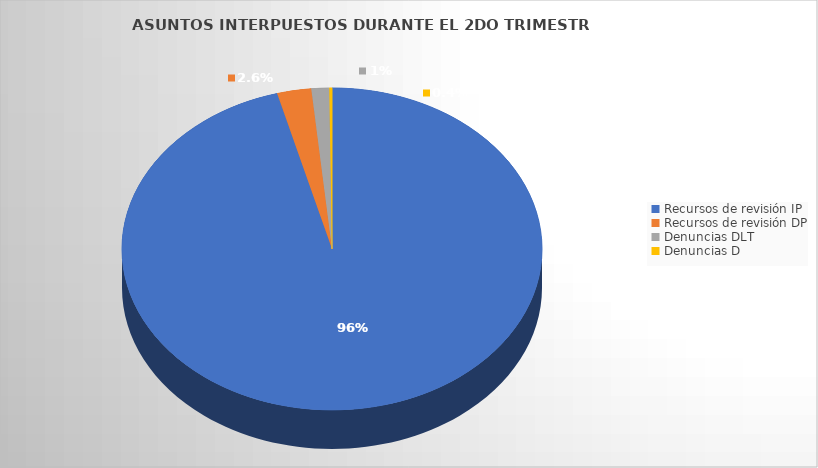
| Category | Series 0 |
|---|---|
| Recursos de revisión IP | 2732 |
| Recursos de revisión DP | 75 |
| Denuncias DLT | 39 |
| Denuncias D | 6 |